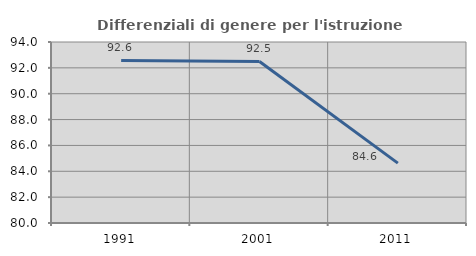
| Category | Differenziali di genere per l'istruzione superiore |
|---|---|
| 1991.0 | 92.573 |
| 2001.0 | 92.492 |
| 2011.0 | 84.631 |